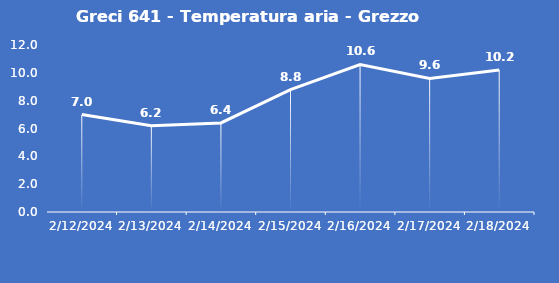
| Category | Greci 641 - Temperatura aria - Grezzo (°C) |
|---|---|
| 2/12/24 | 7 |
| 2/13/24 | 6.2 |
| 2/14/24 | 6.4 |
| 2/15/24 | 8.8 |
| 2/16/24 | 10.6 |
| 2/17/24 | 9.6 |
| 2/18/24 | 10.2 |